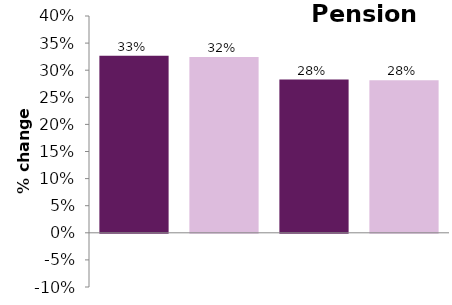
| Category | 0.33 |
|---|---|
| 0 | 0.327 |
| 1 | 0.324 |
| 2 | 0.283 |
| 3 | 0.281 |